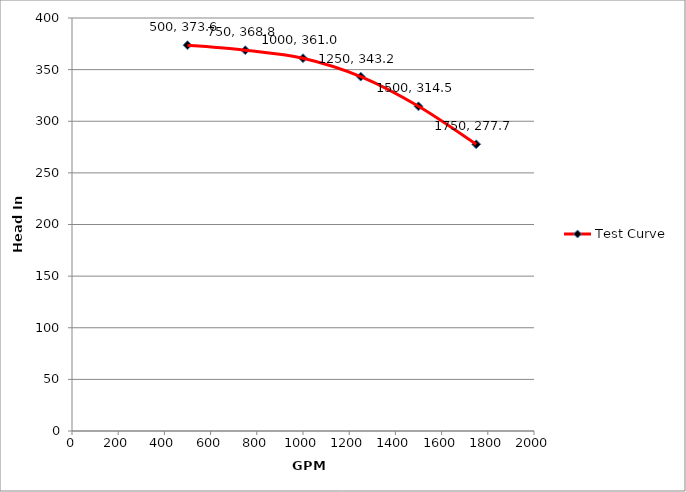
| Category | Test Curve |
|---|---|
| 500.0 | 373.631 |
| 750.0 | 368.77 |
| 1000.0 | 361.025 |
| 1250.0 | 343.195 |
| 1500.0 | 314.481 |
| 1750.0 | 277.683 |